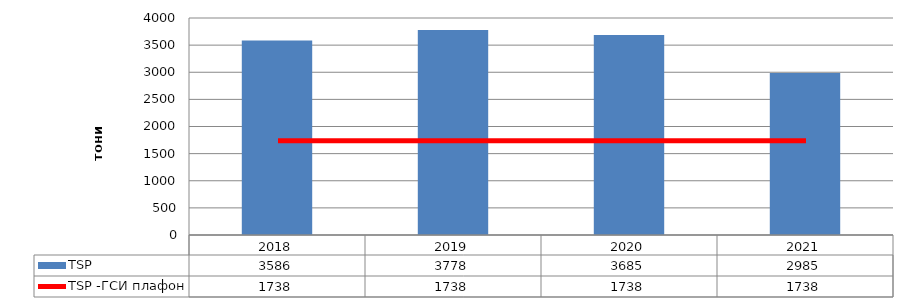
| Category | TSP |
|---|---|
| 2018.0 | 3585.92 |
| 2019.0 | 3778.18 |
| 2020.0 | 3685.38 |
| 2021.0 | 2985.34 |